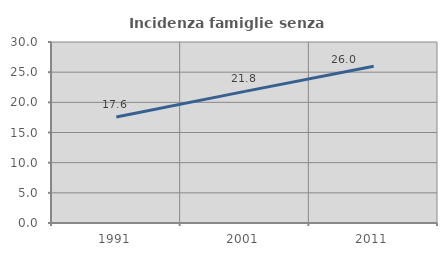
| Category | Incidenza famiglie senza nuclei |
|---|---|
| 1991.0 | 17.571 |
| 2001.0 | 21.818 |
| 2011.0 | 25.979 |